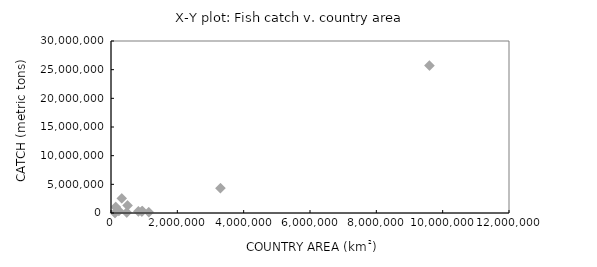
| Category | Total fish catch (MT) |
|---|---|
| 144000.0 | 1047170 |
| 475000.0 | 80000 |
| 9600000.0 | 25721740 |
| 1140000.0 | 146407 |
| 121000.0 | 3826 |
| 238000.0 | 371227 |
| 3300000.0 | 4324235 |
| 825000.0 | 285980 |
| 924000.0 | 255499 |
| 324000.0 | 2550894 |
| 500000.0 | 1320000 |
| 945000.0 | 345000 |